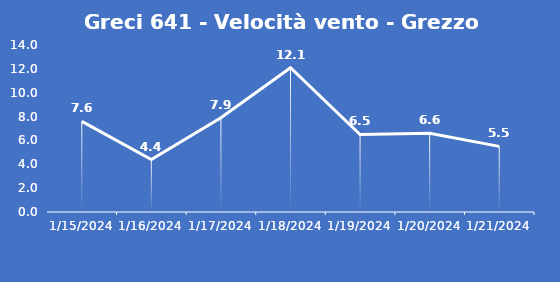
| Category | Greci 641 - Velocità vento - Grezzo (m/s) |
|---|---|
| 1/15/24 | 7.6 |
| 1/16/24 | 4.4 |
| 1/17/24 | 7.9 |
| 1/18/24 | 12.1 |
| 1/19/24 | 6.5 |
| 1/20/24 | 6.6 |
| 1/21/24 | 5.5 |